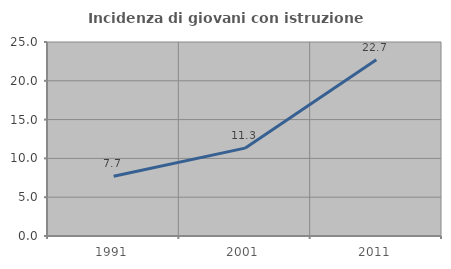
| Category | Incidenza di giovani con istruzione universitaria |
|---|---|
| 1991.0 | 7.692 |
| 2001.0 | 11.321 |
| 2011.0 | 22.727 |